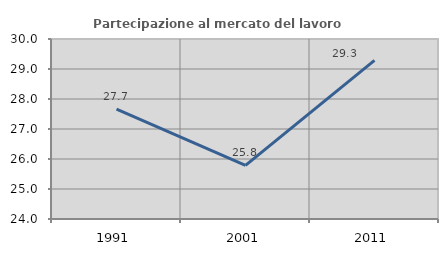
| Category | Partecipazione al mercato del lavoro  femminile |
|---|---|
| 1991.0 | 27.66 |
| 2001.0 | 25.787 |
| 2011.0 | 29.288 |